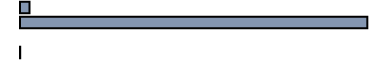
| Category | Series 0 |
|---|---|
| 0 | 2.655 |
| 1 | 97.289 |
| 2 | 0 |
| 3 | 0.056 |